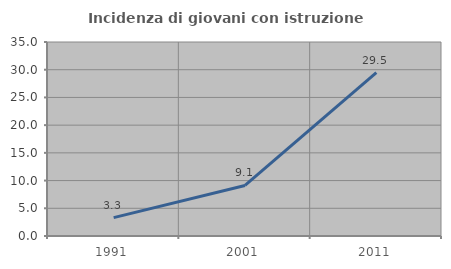
| Category | Incidenza di giovani con istruzione universitaria |
|---|---|
| 1991.0 | 3.311 |
| 2001.0 | 9.123 |
| 2011.0 | 29.492 |